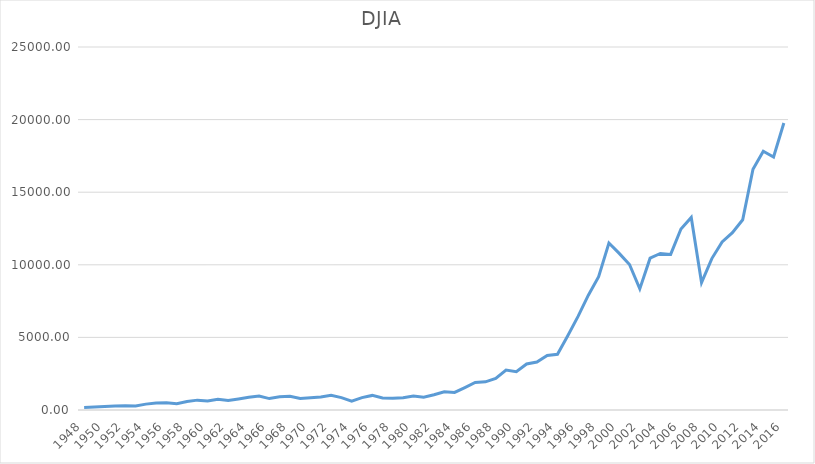
| Category | Series 0 |
|---|---|
| 1948.0 | 177.3 |
| 1949.0 | 200.52 |
| 1950.0 | 235.42 |
| 1951.0 | 269.23 |
| 1952.0 | 291.9 |
| 1953.0 | 280.9 |
| 1954.0 | 404.39 |
| 1955.0 | 488.4 |
| 1956.0 | 499.47 |
| 1957.0 | 435.69 |
| 1958.0 | 583.65 |
| 1959.0 | 679.36 |
| 1960.0 | 615.89 |
| 1961.0 | 731.14 |
| 1962.0 | 652.1 |
| 1963.0 | 762.95 |
| 1964.0 | 874.13 |
| 1965.0 | 969.26 |
| 1966.0 | 785.69 |
| 1967.0 | 905.11 |
| 1968.0 | 943.75 |
| 1969.0 | 800.36 |
| 1970.0 | 838.92 |
| 1971.0 | 890.2 |
| 1972.0 | 1020.02 |
| 1973.0 | 850.86 |
| 1974.0 | 616.24 |
| 1975.0 | 852.41 |
| 1976.0 | 1004.65 |
| 1977.0 | 831.17 |
| 1978.0 | 805.01 |
| 1979.0 | 838.74 |
| 1980.0 | 963.99 |
| 1981.0 | 875 |
| 1982.0 | 1046.54 |
| 1983.0 | 1258.64 |
| 1984.0 | 1211.57 |
| 1985.0 | 1546.67 |
| 1986.0 | 1895.95 |
| 1987.0 | 1938.83 |
| 1988.0 | 2168.57 |
| 1989.0 | 2753.2 |
| 1990.0 | 2633.66 |
| 1991.0 | 3168.83 |
| 1992.0 | 3301.11 |
| 1993.0 | 3754.09 |
| 1994.0 | 3834.44 |
| 1995.0 | 5117.12 |
| 1996.0 | 6448.27 |
| 1997.0 | 7908.25 |
| 1998.0 | 9181.43 |
| 1999.0 | 11497.12 |
| 2000.0 | 10787.99 |
| 2001.0 | 10021.57 |
| 2002.0 | 8341.63 |
| 2003.0 | 10453.92 |
| 2004.0 | 10783.01 |
| 2005.0 | 10717.5 |
| 2006.0 | 12463.15 |
| 2007.0 | 13264.82 |
| 2008.0 | 8776.39 |
| 2009.0 | 10428.05 |
| 2010.0 | 11577.51 |
| 2011.0 | 12217.56 |
| 2012.0 | 13104.14 |
| 2013.0 | 16576.66 |
| 2014.0 | 17823.07 |
| 2015.0 | 17425.029 |
| 2016.0 | 19762.6 |